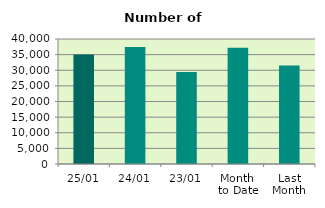
| Category | Series 0 |
|---|---|
| 25/01 | 35024 |
| 24/01 | 37468 |
| 23/01 | 29420 |
| Month 
to Date | 37178.778 |
| Last
Month | 31517.905 |